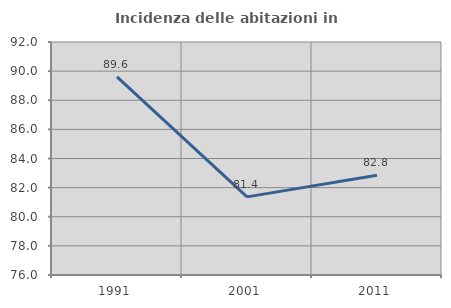
| Category | Incidenza delle abitazioni in proprietà  |
|---|---|
| 1991.0 | 89.608 |
| 2001.0 | 81.364 |
| 2011.0 | 82.844 |